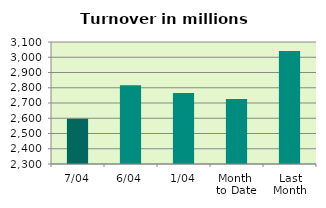
| Category | Series 0 |
|---|---|
| 7/04 | 2597.367 |
| 6/04 | 2815.987 |
| 1/04 | 2766.154 |
| Month 
to Date | 2726.503 |
| Last
Month | 3040.277 |